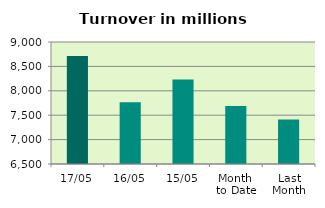
| Category | Series 0 |
|---|---|
| 17/05 | 8710.869 |
| 16/05 | 7763.235 |
| 15/05 | 8233.56 |
| Month 
to Date | 7688.375 |
| Last
Month | 7412.755 |